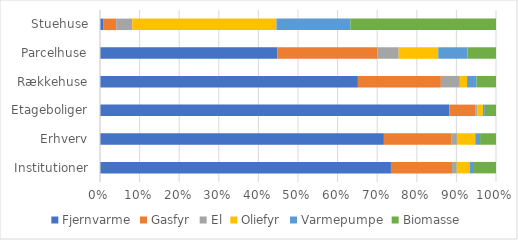
| Category | Fjernvarme | Gasfyr | El | Oliefyr | Varmepumpe | Biomasse |
|---|---|---|---|---|---|---|
| Institutioner | 73.47 | 15.427 | 1.191 | 3.264 | 1.104 | 5.544 |
| Erhverv | 71.69 | 17.123 | 1.322 | 4.628 | 1.217 | 4.021 |
| Etageboliger | 88.206 | 6.543 | 0.553 | 1.403 | 0.48 | 2.815 |
| Rækkehuse | 65.126 | 20.956 | 4.783 | 1.833 | 2.379 | 4.923 |
| Parcelhuse | 44.775 | 25.271 | 5.376 | 9.991 | 7.383 | 7.204 |
| Stuehuse | 0.782 | 3.304 | 4.055 | 36.41 | 18.667 | 36.782 |